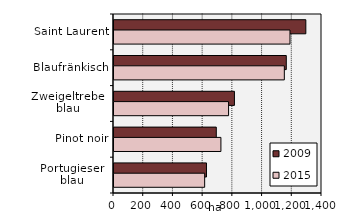
| Category | 2009 | 2015 |
|---|---|---|
| Saint Laurent | 1291.172 | 1184.447 |
| Blaufränkisch | 1159.676 | 1146.464 |
| Zweigeltrebe 
blau | 810.589 | 771.171 |
| Pinot noir | 688.473 | 719.577 |
| Portugieser 
blau | 622.437 | 610.251 |